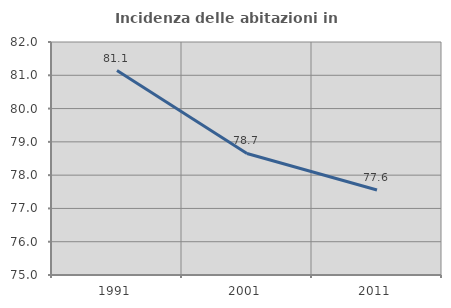
| Category | Incidenza delle abitazioni in proprietà  |
|---|---|
| 1991.0 | 81.143 |
| 2001.0 | 78.652 |
| 2011.0 | 77.552 |